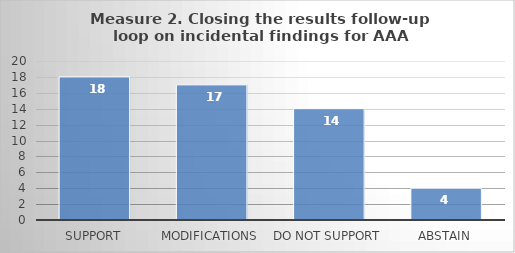
| Category | Series 0 |
|---|---|
| Support | 18 |
| Modifications | 17 |
| Do not support | 14 |
| Abstain | 4 |